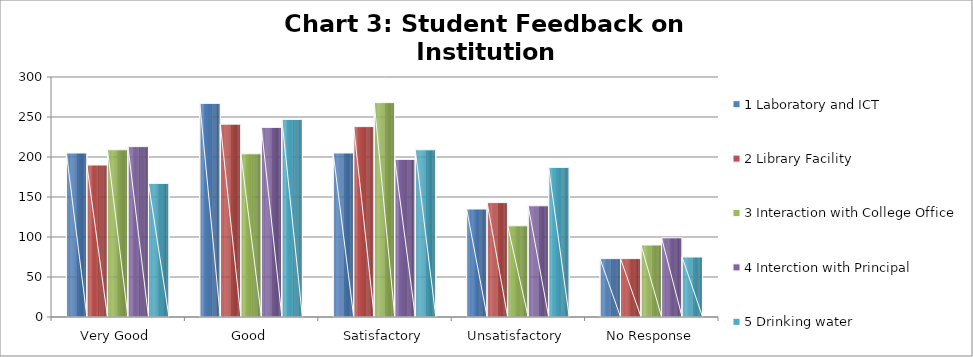
| Category | 1 Laboratory and ICT | 2 Library Facility | 3 Interaction with College Office | 4 Interction with Principal | 5 Drinking water |
|---|---|---|---|---|---|
| Very Good | 205 | 190 | 209 | 213 | 167 |
| Good | 267 | 241 | 204 | 237 | 247 |
| Satisfactory | 205 | 238 | 268 | 197 | 209 |
| Unsatisfactory | 135 | 143 | 114 | 139 | 187 |
| No Response | 73 | 73 | 90 | 99 | 75 |